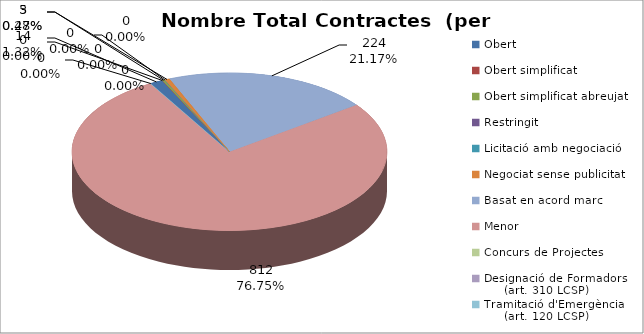
| Category | Nombre Total Contractes |
|---|---|
| Obert | 14 |
| Obert simplificat | 0 |
| Obert simplificat abreujat | 3 |
| Restringit | 0 |
| Licitació amb negociació | 0 |
| Negociat sense publicitat | 5 |
| Basat en acord marc | 224 |
| Menor | 812 |
| Concurs de Projectes | 0 |
| Designació de Formadors
     (art. 310 LCSP) | 0 |
| Tramitació d'Emergència
     (art. 120 LCSP) | 0 |